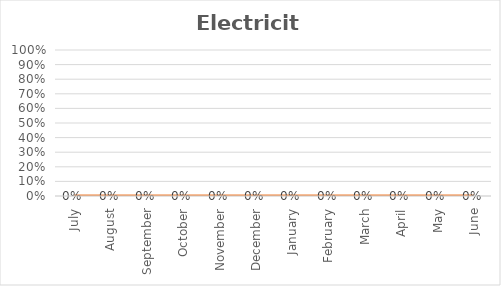
| Category | Electricity |
|---|---|
| July | 0 |
| August | 0 |
| September | 0 |
| October | 0 |
| November | 0 |
| December | 0 |
| January | 0 |
| February | 0 |
| March | 0 |
| April | 0 |
| May | 0 |
| June | 0 |